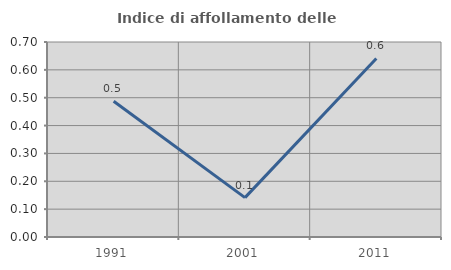
| Category | Indice di affollamento delle abitazioni  |
|---|---|
| 1991.0 | 0.487 |
| 2001.0 | 0.141 |
| 2011.0 | 0.641 |